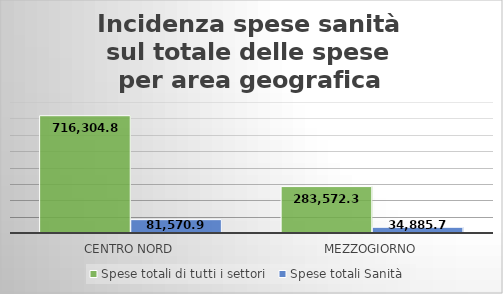
| Category | Spese totali di tutti i settori  | Spese totali Sanità  |
|---|---|---|
| Centro Nord | 716304.817 | 81570.927 |
| Mezzogiorno | 283572.322 | 34885.774 |